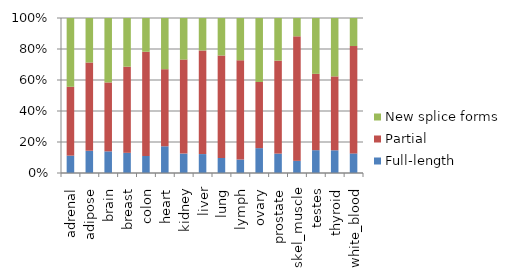
| Category | Full-length | Partial | New splice forms |
|---|---|---|---|
| adrenal | 5705 | 22613 | 22592 |
| adipose | 5593 | 22293 | 11233 |
| brain | 6497 | 20673 | 19329 |
| breast | 5665 | 24190 | 13665 |
| colon | 4689 | 28715 | 9310 |
| heart | 6103 | 17614 | 11701 |
| kidney | 5501 | 26615 | 11775 |
| liver | 4483 | 24563 | 7692 |
| lung | 4958 | 33735 | 12346 |
| lymph | 4574 | 33682 | 14364 |
| ovary | 7017 | 18667 | 18048 |
| prostate | 5673 | 27183 | 12470 |
| skel_muscle | 3318 | 33999 | 4999 |
| testes | 7077 | 23648 | 17306 |
| thyroid | 6487 | 21098 | 16667 |
| white_blood | 4568 | 25004 | 6533 |